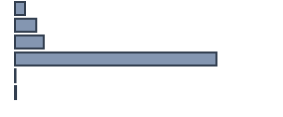
| Category | Series 0 |
|---|---|
| 0 | 3.8 |
| 1 | 8.1 |
| 2 | 10.9 |
| 3 | 76.6 |
| 4 | 0.2 |
| 5 | 0.4 |